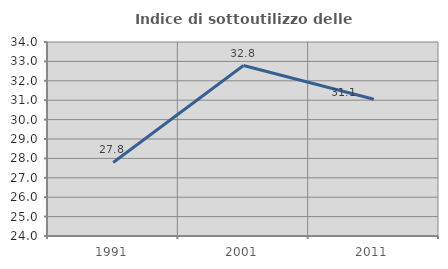
| Category | Indice di sottoutilizzo delle abitazioni  |
|---|---|
| 1991.0 | 27.789 |
| 2001.0 | 32.787 |
| 2011.0 | 31.051 |